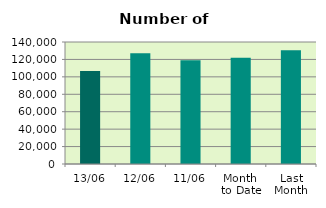
| Category | Series 0 |
|---|---|
| 13/06 | 106798 |
| 12/06 | 127054 |
| 11/06 | 118936 |
| Month 
to Date | 121971.111 |
| Last
Month | 130647.636 |